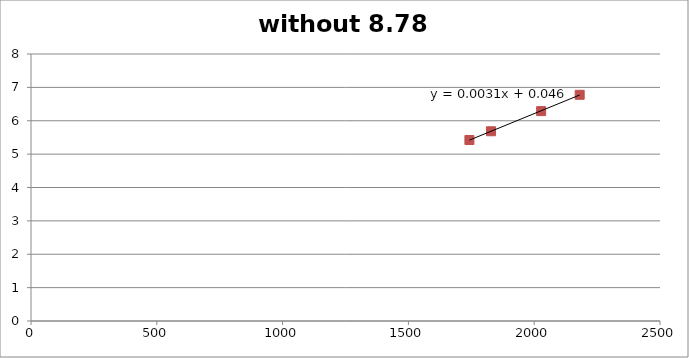
| Category | without 8.78 & |
|---|---|
| 2180.730991553434 | 6.778 |
| 2027.5565699596034 | 6.288 |
| 1828.3638633859712 | 5.685 |
| 1742.5071318398823 | 5.423 |